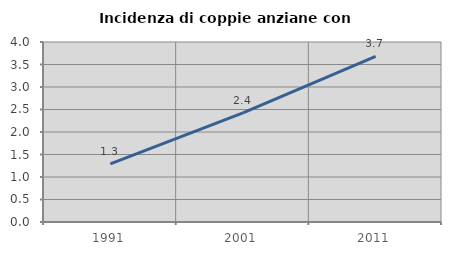
| Category | Incidenza di coppie anziane con figli |
|---|---|
| 1991.0 | 1.292 |
| 2001.0 | 2.426 |
| 2011.0 | 3.679 |